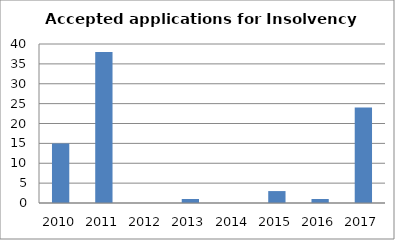
| Category | Series 0 |
|---|---|
| 2010.0 | 15 |
| 2011.0 | 38 |
| 2012.0 | 0 |
| 2013.0 | 1 |
| 2014.0 | 0 |
| 2015.0 | 3 |
| 2016.0 | 1 |
| 2017.0 | 24 |